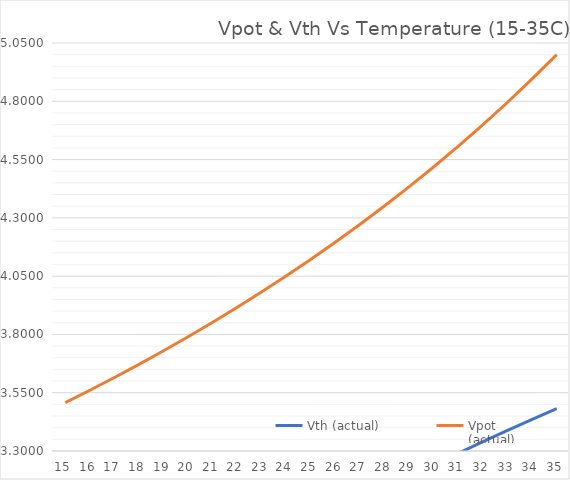
| Category | Vth (actual) | Vpot
(actual) |
|---|---|---|
| 15.0 | 2.394 | 3.507 |
| 16.0 | 2.454 | 3.561 |
| 17.0 | 2.514 | 3.615 |
| 18.0 | 2.573 | 3.672 |
| 19.0 | 2.633 | 3.73 |
| 20.0 | 2.691 | 3.79 |
| 21.0 | 2.75 | 3.852 |
| 22.0 | 2.807 | 3.917 |
| 23.0 | 2.864 | 3.983 |
| 24.0 | 2.92 | 4.052 |
| 25.0 | 2.976 | 4.123 |
| 26.0 | 3.031 | 4.196 |
| 27.0 | 3.084 | 4.273 |
| 28.0 | 3.137 | 4.352 |
| 29.0 | 3.189 | 4.434 |
| 30.0 | 3.24 | 4.519 |
| 31.0 | 3.291 | 4.608 |
| 32.0 | 3.34 | 4.7 |
| 33.0 | 3.388 | 4.796 |
| 34.0 | 3.436 | 4.896 |
| 35.0 | 3.482 | 5 |